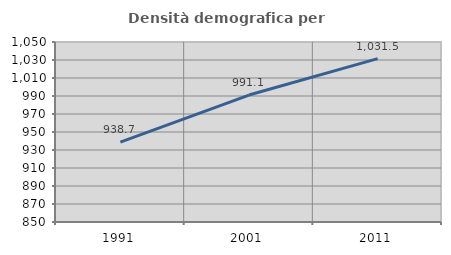
| Category | Densità demografica |
|---|---|
| 1991.0 | 938.742 |
| 2001.0 | 991.061 |
| 2011.0 | 1031.469 |